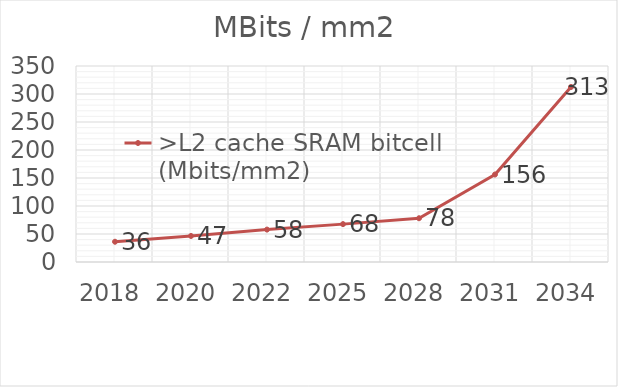
| Category | >L2 cache SRAM bitcell (Mbits/mm2) |
|---|---|
| 2018.0 | 36.169 |
| 2020.0 | 46.503 |
| 2022.0 | 57.87 |
| 2025.0 | 67.641 |
| 2028.0 | 78.125 |
| 2031.0 | 156.25 |
| 2034.0 | 312.5 |